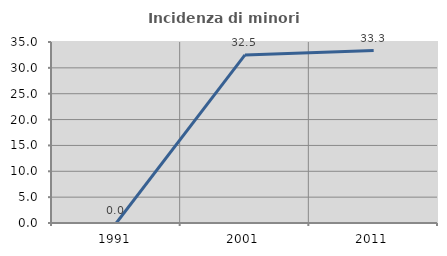
| Category | Incidenza di minori stranieri |
|---|---|
| 1991.0 | 0 |
| 2001.0 | 32.5 |
| 2011.0 | 33.333 |